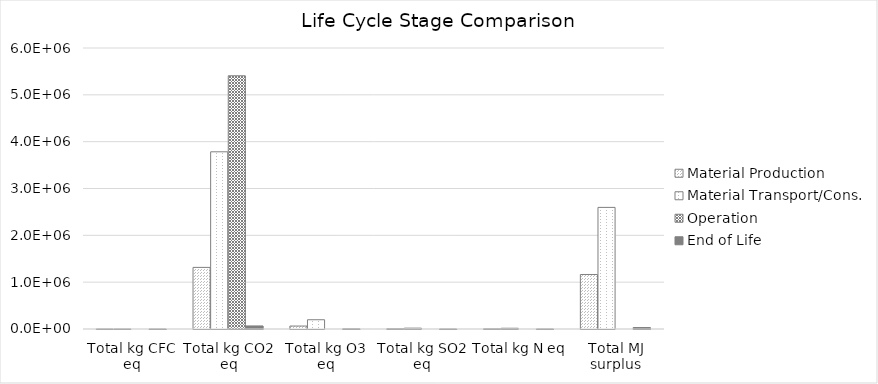
| Category | Material Production | Material Transport/Cons. | Operation | End of Life |
|---|---|---|---|---|
| Total kg CFC eq | 12.503 | 0.246 | 0 | 0.003 |
| Total kg CO2 eq | 1315381.584 | 3783627.502 | 5406994.081 | 65346.806 |
| Total kg O3 eq | 62812.757 | 197790.121 | 0 | 3032.044 |
| Total kg SO2 eq | 5123.654 | 18201.644 | 0 | 169.084 |
| Total kg N eq | 4015.587 | 16005.986 | 0 | 67.38 |
| Total MJ surplus | 1163964.58 | 2596475.776 | 0 | 31315.636 |